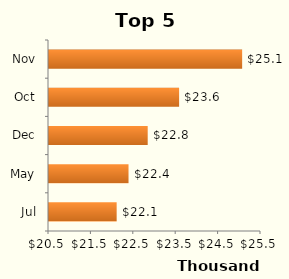
| Category | Total |
|---|---|
| Jul | 22095.785 |
| May | 22375.569 |
| Dec | 22827.835 |
| Oct | 23568.83 |
| Nov | 25055.399 |